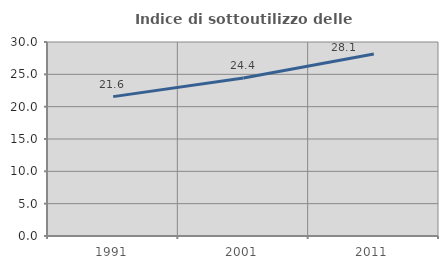
| Category | Indice di sottoutilizzo delle abitazioni  |
|---|---|
| 1991.0 | 21.555 |
| 2001.0 | 24.419 |
| 2011.0 | 28.141 |